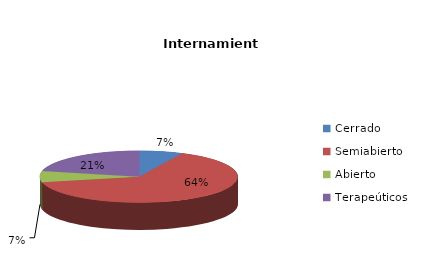
| Category | Series 0 |
|---|---|
| Cerrado | 1 |
| Semiabierto | 9 |
| Abierto | 1 |
| Terapeúticos | 3 |